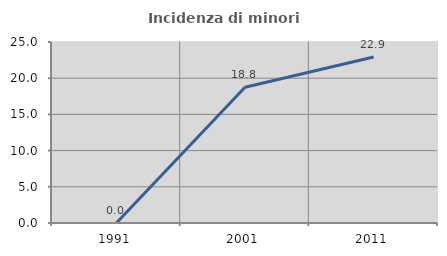
| Category | Incidenza di minori stranieri |
|---|---|
| 1991.0 | 0 |
| 2001.0 | 18.75 |
| 2011.0 | 22.917 |